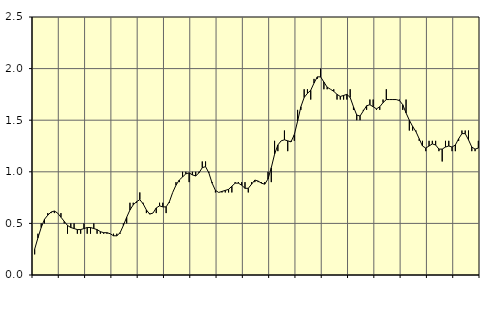
| Category | Piggar | Sysselsatta utomlands |
|---|---|---|
| nan | 0.2 | 0.25 |
| 87.0 | 0.4 | 0.36 |
| 87.0 | 0.5 | 0.46 |
| 87.0 | 0.5 | 0.54 |
| nan | 0.6 | 0.58 |
| 88.0 | 0.6 | 0.61 |
| 88.0 | 0.6 | 0.62 |
| 88.0 | 0.6 | 0.6 |
| nan | 0.6 | 0.56 |
| 89.0 | 0.5 | 0.52 |
| 89.0 | 0.4 | 0.48 |
| 89.0 | 0.5 | 0.46 |
| nan | 0.5 | 0.45 |
| 90.0 | 0.4 | 0.44 |
| 90.0 | 0.4 | 0.44 |
| 90.0 | 0.5 | 0.45 |
| nan | 0.4 | 0.46 |
| 91.0 | 0.4 | 0.46 |
| 91.0 | 0.5 | 0.45 |
| 91.0 | 0.4 | 0.44 |
| nan | 0.4 | 0.42 |
| 92.0 | 0.4 | 0.41 |
| 92.0 | 0.4 | 0.41 |
| 92.0 | 0.4 | 0.4 |
| nan | 0.4 | 0.38 |
| 93.0 | 0.4 | 0.38 |
| 93.0 | 0.4 | 0.41 |
| 93.0 | 0.5 | 0.48 |
| nan | 0.5 | 0.56 |
| 94.0 | 0.7 | 0.63 |
| 94.0 | 0.7 | 0.68 |
| 94.0 | 0.7 | 0.71 |
| nan | 0.8 | 0.73 |
| 95.0 | 0.7 | 0.69 |
| 95.0 | 0.6 | 0.63 |
| 95.0 | 0.6 | 0.59 |
| nan | 0.6 | 0.6 |
| 96.0 | 0.6 | 0.65 |
| 96.0 | 0.7 | 0.67 |
| 96.0 | 0.7 | 0.66 |
| nan | 0.6 | 0.66 |
| 97.0 | 0.7 | 0.71 |
| 97.0 | 0.8 | 0.8 |
| 97.0 | 0.9 | 0.87 |
| nan | 0.9 | 0.92 |
| 98.0 | 1 | 0.95 |
| 98.0 | 1 | 0.98 |
| 98.0 | 0.9 | 0.99 |
| nan | 1 | 0.97 |
| 99.0 | 1 | 0.96 |
| 99.0 | 1 | 0.99 |
| 99.0 | 1.1 | 1.04 |
| nan | 1.1 | 1.05 |
| 0.0 | 1 | 0.99 |
| 0.0 | 0.9 | 0.89 |
| 0.0 | 0.8 | 0.82 |
| nan | 0.8 | 0.8 |
| 1.0 | 0.8 | 0.81 |
| 1.0 | 0.8 | 0.82 |
| 1.0 | 0.8 | 0.83 |
| nan | 0.8 | 0.86 |
| 2.0 | 0.9 | 0.89 |
| 2.0 | 0.9 | 0.89 |
| 2.0 | 0.9 | 0.87 |
| nan | 0.9 | 0.84 |
| 3.0 | 0.8 | 0.84 |
| 3.0 | 0.9 | 0.88 |
| 3.0 | 0.9 | 0.92 |
| nan | 0.9 | 0.91 |
| 4.0 | 0.9 | 0.89 |
| 4.0 | 0.9 | 0.88 |
| 4.0 | 1 | 0.93 |
| nan | 0.9 | 1.04 |
| 5.0 | 1.3 | 1.17 |
| 5.0 | 1.2 | 1.26 |
| 5.0 | 1.3 | 1.3 |
| nan | 1.4 | 1.31 |
| 6.0 | 1.2 | 1.3 |
| 6.0 | 1.3 | 1.29 |
| 6.0 | 1.3 | 1.36 |
| nan | 1.6 | 1.49 |
| 7.0 | 1.6 | 1.63 |
| 7.0 | 1.8 | 1.72 |
| 7.0 | 1.8 | 1.76 |
| nan | 1.7 | 1.79 |
| 8.0 | 1.9 | 1.86 |
| 8.0 | 1.9 | 1.92 |
| 8.0 | 2 | 1.92 |
| nan | 1.8 | 1.87 |
| 9.0 | 1.8 | 1.82 |
| 9.0 | 1.8 | 1.8 |
| 9.0 | 1.8 | 1.78 |
| nan | 1.7 | 1.75 |
| 10.0 | 1.7 | 1.73 |
| 10.0 | 1.7 | 1.74 |
| 10.0 | 1.7 | 1.75 |
| nan | 1.8 | 1.72 |
| 11.0 | 1.6 | 1.63 |
| 11.0 | 1.5 | 1.55 |
| 11.0 | 1.5 | 1.54 |
| nan | 1.6 | 1.59 |
| 12.0 | 1.6 | 1.64 |
| 12.0 | 1.7 | 1.65 |
| 12.0 | 1.7 | 1.63 |
| nan | 1.6 | 1.61 |
| 13.0 | 1.6 | 1.63 |
| 13.0 | 1.7 | 1.67 |
| 13.0 | 1.8 | 1.7 |
| nan | 1.7 | 1.7 |
| 14.0 | 1.7 | 1.7 |
| 14.0 | 1.7 | 1.7 |
| 14.0 | 1.7 | 1.69 |
| nan | 1.6 | 1.65 |
| 15.0 | 1.7 | 1.57 |
| 15.0 | 1.4 | 1.5 |
| 15.0 | 1.4 | 1.44 |
| nan | 1.4 | 1.39 |
| 16.0 | 1.3 | 1.32 |
| 16.0 | 1.3 | 1.25 |
| 16.0 | 1.2 | 1.23 |
| nan | 1.3 | 1.25 |
| 17.0 | 1.3 | 1.27 |
| 17.0 | 1.3 | 1.26 |
| 17.0 | 1.2 | 1.22 |
| nan | 1.1 | 1.22 |
| 18.0 | 1.3 | 1.24 |
| 18.0 | 1.3 | 1.25 |
| 18.0 | 1.2 | 1.24 |
| nan | 1.2 | 1.26 |
| 19.0 | 1.3 | 1.32 |
| 19.0 | 1.4 | 1.37 |
| 19.0 | 1.4 | 1.37 |
| nan | 1.4 | 1.31 |
| 20.0 | 1.2 | 1.24 |
| 20.0 | 1.2 | 1.22 |
| 20.0 | 1.3 | 1.23 |